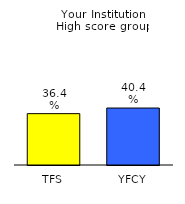
| Category | Series 0 |
|---|---|
| TFS | 0.364 |
| YFCY | 0.404 |